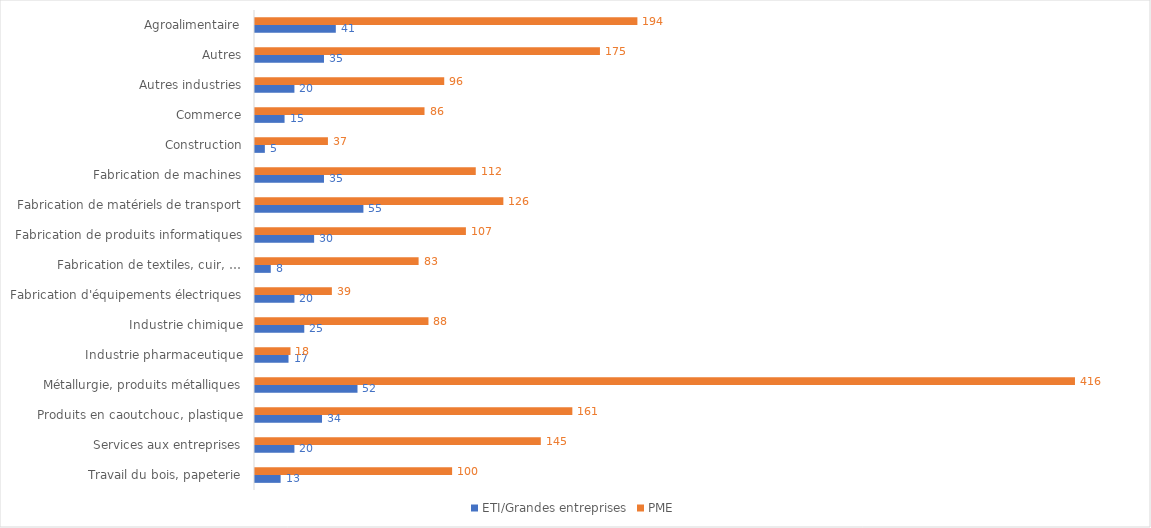
| Category | ETI/Grandes entreprises | PME |
|---|---|---|
| Travail du bois, papeterie | 13 | 100 |
| Services aux entreprises | 20 | 145 |
| Produits en caoutchouc, plastique | 34 | 161 |
| Métallurgie, produits métalliques | 52 | 416 |
| Industrie pharmaceutique | 17 | 18 |
| Industrie chimique | 25 | 88 |
| Fabrication d'équipements électriques | 20 | 39 |
| Fabrication de textiles, cuir, … | 8 | 83 |
| Fabrication de produits informatiques | 30 | 107 |
| Fabrication de matériels de transport | 55 | 126 |
| Fabrication de machines | 35 | 112 |
| Construction | 5 | 37 |
| Commerce | 15 | 86 |
| Autres industries | 20 | 96 |
| Autres | 35 | 175 |
| Agroalimentaire | 41 | 194 |